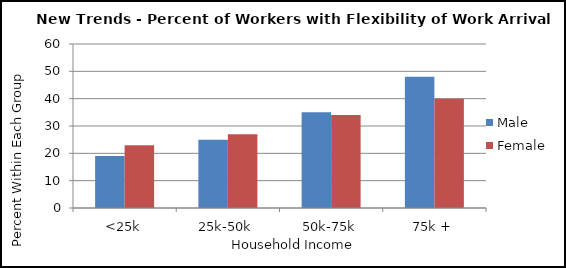
| Category | Male | Female |
|---|---|---|
| <25k | 19 | 23 |
| 25k-50k | 25 | 27 |
| 50k-75k | 35 | 34 |
| 75k + | 48 | 40 |